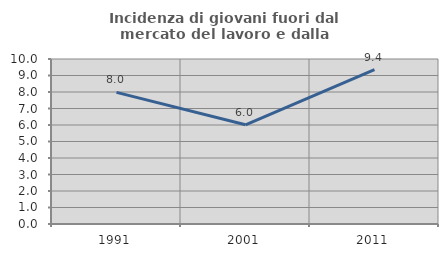
| Category | Incidenza di giovani fuori dal mercato del lavoro e dalla formazione  |
|---|---|
| 1991.0 | 7.977 |
| 2001.0 | 6.014 |
| 2011.0 | 9.35 |